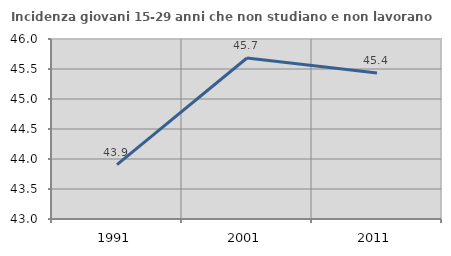
| Category | Incidenza giovani 15-29 anni che non studiano e non lavorano  |
|---|---|
| 1991.0 | 43.907 |
| 2001.0 | 45.683 |
| 2011.0 | 45.434 |